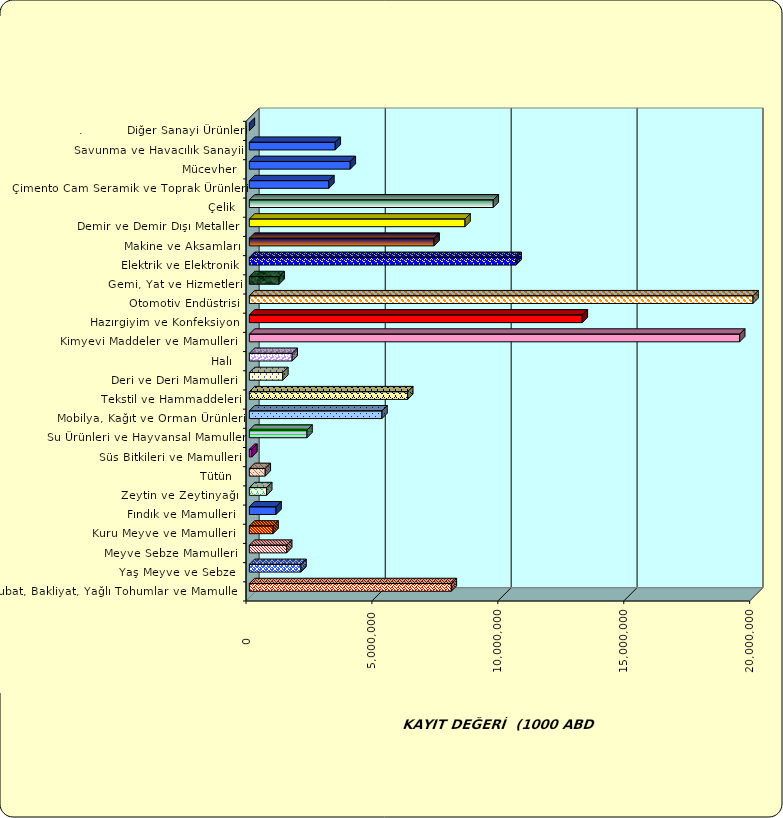
| Category | Series 0 |
|---|---|
|  Hububat, Bakliyat, Yağlı Tohumlar ve Mamulleri  | 8019315.37 |
|  Yaş Meyve ve Sebze   | 2050709.973 |
|  Meyve Sebze Mamulleri  | 1482001.901 |
|  Kuru Meyve ve Mamulleri   | 941352.148 |
|  Fındık ve Mamulleri  | 1059596.913 |
|  Zeytin ve Zeytinyağı  | 688773.833 |
|  Tütün  | 631061.65 |
|  Süs Bitkileri ve Mamulleri | 99859.017 |
|  Su Ürünleri ve Hayvansal Mamuller | 2288646.387 |
|  Mobilya, Kağıt ve Orman Ürünleri | 5265502.496 |
|  Tekstil ve Hammaddeleri | 6287924.627 |
|  Deri ve Deri Mamulleri  | 1328868.989 |
|  Halı  | 1700799.298 |
|  Kimyevi Maddeler ve Mamulleri   | 19470715.003 |
|  Hazırgiyim ve Konfeksiyon  | 13220253.785 |
|  Otomotiv Endüstrisi | 22801643.206 |
|  Gemi, Yat ve Hizmetleri | 1182253.634 |
|  Elektrik ve Elektronik | 10592582.305 |
|  Makine ve Aksamları | 7334715.566 |
|  Demir ve Demir Dışı Metaller  | 8563125.935 |
|  Çelik | 9685966.154 |
|  Çimento Cam Seramik ve Toprak Ürünleri | 3156707.435 |
|  Mücevher | 4007905.97 |
|  Savunma ve Havacılık Sanayii | 3410444.074 |
| .           Diğer Sanayi Ürünleri | 0 |